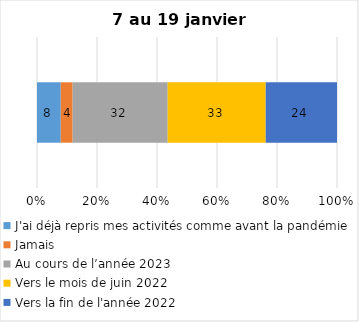
| Category | J'ai déjà repris mes activités comme avant la pandémie | Jamais | Au cours de l’année 2023 | Vers le mois de juin 2022 | Vers la fin de l'année 2022 |
|---|---|---|---|---|---|
| 0 | 8 | 4 | 32 | 33 | 24 |